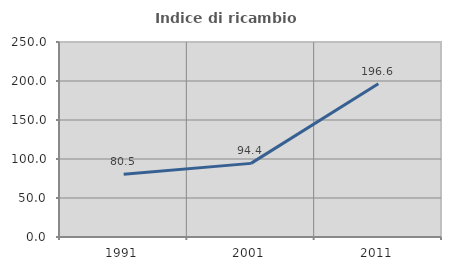
| Category | Indice di ricambio occupazionale  |
|---|---|
| 1991.0 | 80.473 |
| 2001.0 | 94.388 |
| 2011.0 | 196.599 |